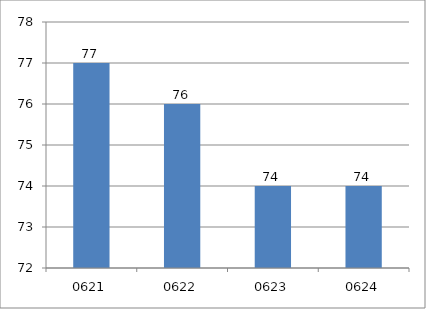
| Category | Series 0 |
|---|---|
| 621.0 | 77 |
| 622.0 | 76 |
| 623.0 | 74 |
| 624.0 | 74 |